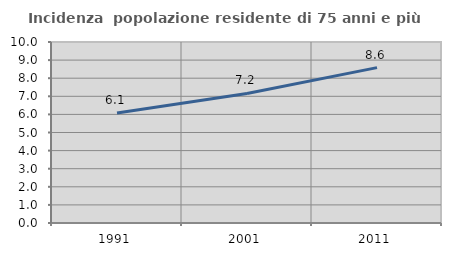
| Category | Incidenza  popolazione residente di 75 anni e più |
|---|---|
| 1991.0 | 6.072 |
| 2001.0 | 7.156 |
| 2011.0 | 8.585 |